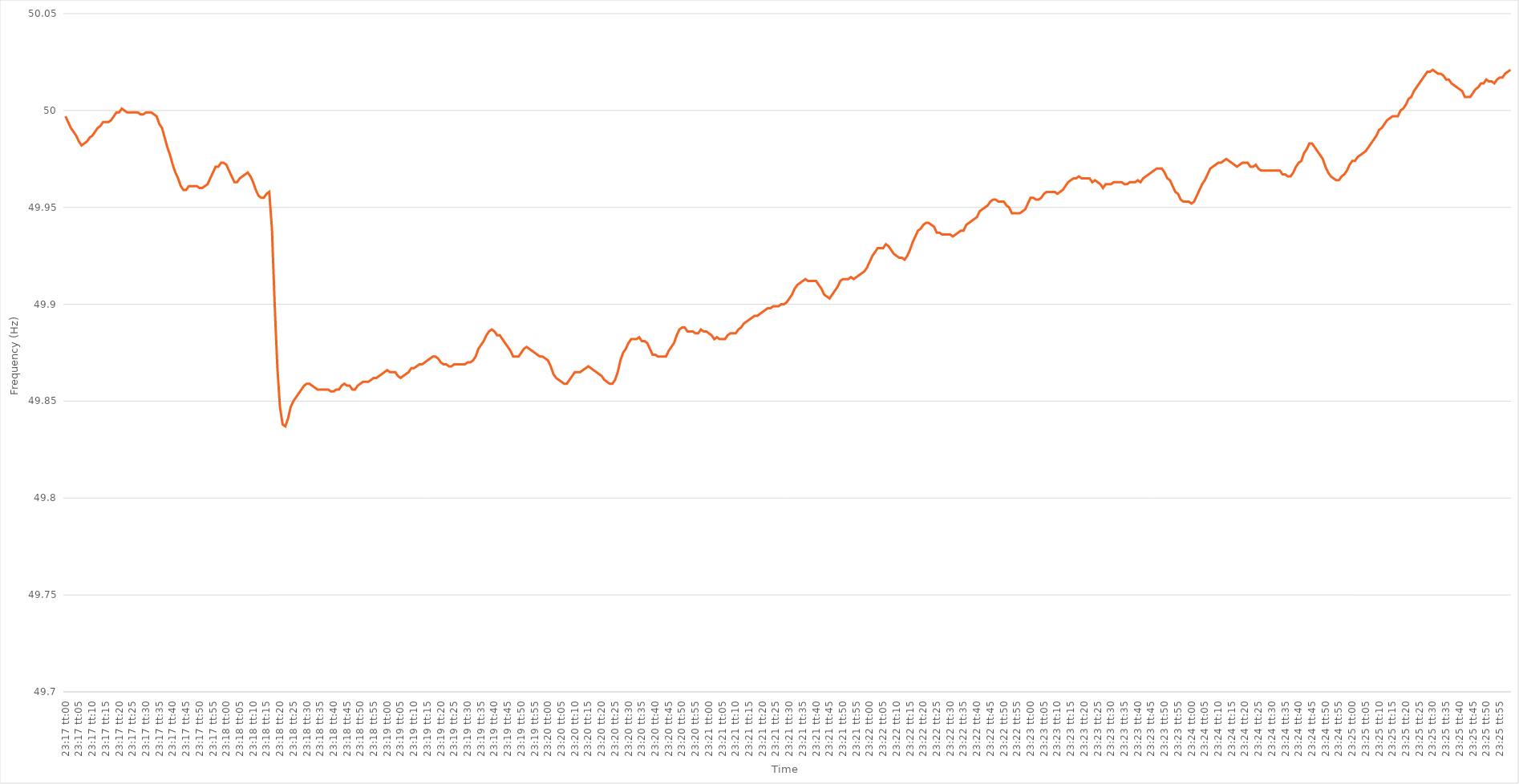
| Category | Series 0 |
|---|---|
| 0.970138888888889 | 49.997 |
| 0.9701504629629629 | 49.994 |
| 0.9701620370370371 | 49.991 |
| 0.9701736111111111 | 49.989 |
| 0.9701851851851852 | 49.987 |
| 0.9701967592592592 | 49.984 |
| 0.9702083333333333 | 49.982 |
| 0.9702199074074075 | 49.983 |
| 0.9702314814814814 | 49.984 |
| 0.9702430555555556 | 49.986 |
| 0.9702546296296296 | 49.987 |
| 0.9702662037037038 | 49.989 |
| 0.9702777777777777 | 49.991 |
| 0.9702893518518518 | 49.992 |
| 0.970300925925926 | 49.994 |
| 0.9703125 | 49.994 |
| 0.9703240740740741 | 49.994 |
| 0.9703356481481481 | 49.995 |
| 0.9703472222222222 | 49.997 |
| 0.9703587962962964 | 49.999 |
| 0.9703703703703703 | 49.999 |
| 0.9703819444444445 | 50.001 |
| 0.9703935185185185 | 50 |
| 0.9704050925925927 | 49.999 |
| 0.9704166666666666 | 49.999 |
| 0.9704282407407407 | 49.999 |
| 0.9704398148148149 | 49.999 |
| 0.9704513888888888 | 49.999 |
| 0.970462962962963 | 49.998 |
| 0.970474537037037 | 49.998 |
| 0.9704861111111112 | 49.999 |
| 0.9704976851851851 | 49.999 |
| 0.9705092592592592 | 49.999 |
| 0.9705208333333334 | 49.998 |
| 0.9705324074074074 | 49.997 |
| 0.9705439814814815 | 49.993 |
| 0.9705555555555555 | 49.991 |
| 0.9705671296296297 | 49.986 |
| 0.9705787037037038 | 49.981 |
| 0.9705902777777777 | 49.977 |
| 0.9706018518518519 | 49.972 |
| 0.9706134259259259 | 49.968 |
| 0.9706250000000001 | 49.965 |
| 0.970636574074074 | 49.961 |
| 0.9706481481481481 | 49.959 |
| 0.9706597222222223 | 49.959 |
| 0.9706712962962962 | 49.961 |
| 0.9706828703703704 | 49.961 |
| 0.9706944444444444 | 49.961 |
| 0.9707060185185186 | 49.961 |
| 0.9707175925925925 | 49.96 |
| 0.9707291666666666 | 49.96 |
| 0.9707407407407408 | 49.961 |
| 0.9707523148148148 | 49.962 |
| 0.9707638888888889 | 49.965 |
| 0.9707754629629629 | 49.968 |
| 0.9707870370370371 | 49.971 |
| 0.9707986111111112 | 49.971 |
| 0.9708101851851851 | 49.973 |
| 0.9708217592592593 | 49.973 |
| 0.9708333333333333 | 49.972 |
| 0.9708449074074075 | 49.969 |
| 0.9708564814814814 | 49.966 |
| 0.9708680555555556 | 49.963 |
| 0.9708796296296297 | 49.963 |
| 0.9708912037037036 | 49.965 |
| 0.9709027777777778 | 49.966 |
| 0.9709143518518518 | 49.967 |
| 0.970925925925926 | 49.968 |
| 0.9709374999999999 | 49.966 |
| 0.970949074074074 | 49.963 |
| 0.9709606481481482 | 49.959 |
| 0.9709722222222222 | 49.956 |
| 0.9709837962962963 | 49.955 |
| 0.9709953703703703 | 49.955 |
| 0.9710069444444445 | 49.957 |
| 0.9710185185185186 | 49.958 |
| 0.9710300925925925 | 49.939 |
| 0.9710416666666667 | 49.901 |
| 0.9710532407407407 | 49.868 |
| 0.9710648148148149 | 49.847 |
| 0.9710763888888888 | 49.838 |
| 0.971087962962963 | 49.837 |
| 0.9710995370370371 | 49.841 |
| 0.971111111111111 | 49.847 |
| 0.9711226851851852 | 49.85 |
| 0.9711342592592592 | 49.852 |
| 0.9711458333333334 | 49.854 |
| 0.9711574074074073 | 49.856 |
| 0.9711689814814815 | 49.858 |
| 0.9711805555555556 | 49.859 |
| 0.9711921296296296 | 49.859 |
| 0.9712037037037037 | 49.858 |
| 0.9712152777777777 | 49.857 |
| 0.9712268518518519 | 49.856 |
| 0.971238425925926 | 49.856 |
| 0.97125 | 49.856 |
| 0.9712615740740741 | 49.856 |
| 0.9712731481481481 | 49.856 |
| 0.9712847222222223 | 49.855 |
| 0.9712962962962962 | 49.855 |
| 0.9713078703703704 | 49.856 |
| 0.9713194444444445 | 49.856 |
| 0.9713310185185186 | 49.858 |
| 0.9713425925925926 | 49.859 |
| 0.9713541666666666 | 49.858 |
| 0.9713657407407408 | 49.858 |
| 0.9713773148148147 | 49.856 |
| 0.9713888888888889 | 49.856 |
| 0.971400462962963 | 49.858 |
| 0.971412037037037 | 49.859 |
| 0.9714236111111111 | 49.86 |
| 0.9714351851851851 | 49.86 |
| 0.9714467592592593 | 49.86 |
| 0.9714583333333334 | 49.861 |
| 0.9714699074074074 | 49.862 |
| 0.9714814814814815 | 49.862 |
| 0.9714930555555555 | 49.863 |
| 0.9715046296296297 | 49.864 |
| 0.9715162037037036 | 49.865 |
| 0.9715277777777778 | 49.866 |
| 0.9715393518518519 | 49.865 |
| 0.971550925925926 | 49.865 |
| 0.9715625 | 49.865 |
| 0.971574074074074 | 49.863 |
| 0.9715856481481482 | 49.862 |
| 0.9715972222222223 | 49.863 |
| 0.9716087962962963 | 49.864 |
| 0.9716203703703704 | 49.865 |
| 0.9716319444444445 | 49.867 |
| 0.9716435185185185 | 49.867 |
| 0.9716550925925925 | 49.868 |
| 0.9716666666666667 | 49.869 |
| 0.9716782407407408 | 49.869 |
| 0.9716898148148148 | 49.87 |
| 0.9717013888888889 | 49.871 |
| 0.971712962962963 | 49.872 |
| 0.9717245370370371 | 49.873 |
| 0.971736111111111 | 49.873 |
| 0.9717476851851852 | 49.872 |
| 0.9717592592592593 | 49.87 |
| 0.9717708333333334 | 49.869 |
| 0.9717824074074074 | 49.869 |
| 0.9717939814814814 | 49.868 |
| 0.9718055555555556 | 49.868 |
| 0.9718171296296297 | 49.869 |
| 0.9718287037037037 | 49.869 |
| 0.9718402777777778 | 49.869 |
| 0.9718518518518519 | 49.869 |
| 0.9718634259259259 | 49.869 |
| 0.9718749999999999 | 49.87 |
| 0.9718865740740741 | 49.87 |
| 0.9718981481481482 | 49.871 |
| 0.9719097222222222 | 49.873 |
| 0.9719212962962963 | 49.877 |
| 0.9719328703703703 | 49.879 |
| 0.9719444444444445 | 49.881 |
| 0.9719560185185184 | 49.884 |
| 0.9719675925925926 | 49.886 |
| 0.9719791666666667 | 49.887 |
| 0.9719907407407408 | 49.886 |
| 0.9720023148148148 | 49.884 |
| 0.9720138888888888 | 49.884 |
| 0.972025462962963 | 49.882 |
| 0.9720370370370371 | 49.88 |
| 0.9720486111111111 | 49.878 |
| 0.9720601851851852 | 49.876 |
| 0.9720717592592593 | 49.873 |
| 0.9720833333333333 | 49.873 |
| 0.9720949074074073 | 49.873 |
| 0.9721064814814815 | 49.875 |
| 0.9721180555555556 | 49.877 |
| 0.9721296296296296 | 49.878 |
| 0.9721412037037037 | 49.877 |
| 0.9721527777777778 | 49.876 |
| 0.9721643518518519 | 49.875 |
| 0.9721759259259258 | 49.874 |
| 0.9721875 | 49.873 |
| 0.9721990740740741 | 49.873 |
| 0.9722106481481482 | 49.872 |
| 0.9722222222222222 | 49.871 |
| 0.9722337962962962 | 49.868 |
| 0.9722453703703704 | 49.864 |
| 0.9722569444444445 | 49.862 |
| 0.9722685185185185 | 49.861 |
| 0.9722800925925926 | 49.86 |
| 0.9722916666666667 | 49.859 |
| 0.9723032407407407 | 49.859 |
| 0.9723148148148147 | 49.861 |
| 0.9723263888888889 | 49.863 |
| 0.972337962962963 | 49.865 |
| 0.972349537037037 | 49.865 |
| 0.9723611111111111 | 49.865 |
| 0.9723726851851852 | 49.866 |
| 0.9723842592592593 | 49.867 |
| 0.9723958333333332 | 49.868 |
| 0.9724074074074074 | 49.867 |
| 0.9724189814814815 | 49.866 |
| 0.9724305555555556 | 49.865 |
| 0.9724421296296296 | 49.864 |
| 0.9724537037037037 | 49.863 |
| 0.9724652777777778 | 49.861 |
| 0.972476851851852 | 49.86 |
| 0.9724884259259259 | 49.859 |
| 0.9725 | 49.859 |
| 0.9725115740740741 | 49.861 |
| 0.9725231481481482 | 49.865 |
| 0.9725347222222221 | 49.871 |
| 0.9725462962962963 | 49.875 |
| 0.9725578703703704 | 49.877 |
| 0.9725694444444444 | 49.88 |
| 0.9725810185185185 | 49.882 |
| 0.9725925925925926 | 49.882 |
| 0.9726041666666667 | 49.882 |
| 0.9726157407407406 | 49.883 |
| 0.9726273148148148 | 49.881 |
| 0.9726388888888889 | 49.881 |
| 0.972650462962963 | 49.88 |
| 0.972662037037037 | 49.877 |
| 0.9726736111111111 | 49.874 |
| 0.9726851851851852 | 49.874 |
| 0.9726967592592594 | 49.873 |
| 0.9727083333333333 | 49.873 |
| 0.9727199074074074 | 49.873 |
| 0.9727314814814815 | 49.873 |
| 0.9727430555555556 | 49.876 |
| 0.9727546296296296 | 49.878 |
| 0.9727662037037037 | 49.88 |
| 0.9727777777777779 | 49.884 |
| 0.9727893518518518 | 49.887 |
| 0.9728009259259259 | 49.888 |
| 0.9728125 | 49.888 |
| 0.9728240740740741 | 49.886 |
| 0.972835648148148 | 49.886 |
| 0.9728472222222222 | 49.886 |
| 0.9728587962962963 | 49.885 |
| 0.9728703703703704 | 49.885 |
| 0.9728819444444444 | 49.887 |
| 0.9728935185185185 | 49.886 |
| 0.9729050925925926 | 49.886 |
| 0.9729166666666668 | 49.885 |
| 0.9729282407407407 | 49.884 |
| 0.9729398148148148 | 49.882 |
| 0.9729513888888889 | 49.883 |
| 0.972962962962963 | 49.882 |
| 0.972974537037037 | 49.882 |
| 0.9729861111111111 | 49.882 |
| 0.9729976851851853 | 49.884 |
| 0.9730092592592593 | 49.885 |
| 0.9730208333333333 | 49.885 |
| 0.9730324074074074 | 49.885 |
| 0.9730439814814815 | 49.887 |
| 0.9730555555555555 | 49.888 |
| 0.9730671296296296 | 49.89 |
| 0.9730787037037038 | 49.891 |
| 0.9730902777777778 | 49.892 |
| 0.9731018518518518 | 49.893 |
| 0.9731134259259259 | 49.894 |
| 0.973125 | 49.894 |
| 0.9731365740740742 | 49.895 |
| 0.9731481481481481 | 49.896 |
| 0.9731597222222222 | 49.897 |
| 0.9731712962962963 | 49.898 |
| 0.9731828703703704 | 49.898 |
| 0.9731944444444444 | 49.899 |
| 0.9732060185185185 | 49.899 |
| 0.9732175925925927 | 49.899 |
| 0.9732291666666667 | 49.9 |
| 0.9732407407407407 | 49.9 |
| 0.9732523148148148 | 49.901 |
| 0.9732638888888889 | 49.903 |
| 0.9732754629629629 | 49.905 |
| 0.973287037037037 | 49.908 |
| 0.9732986111111112 | 49.91 |
| 0.9733101851851852 | 49.911 |
| 0.9733217592592592 | 49.912 |
| 0.9733333333333333 | 49.913 |
| 0.9733449074074074 | 49.912 |
| 0.9733564814814816 | 49.912 |
| 0.9733680555555555 | 49.912 |
| 0.9733796296296297 | 49.912 |
| 0.9733912037037037 | 49.91 |
| 0.9734027777777778 | 49.908 |
| 0.9734143518518518 | 49.905 |
| 0.9734259259259259 | 49.904 |
| 0.9734375000000001 | 49.903 |
| 0.9734490740740741 | 49.905 |
| 0.9734606481481481 | 49.907 |
| 0.9734722222222222 | 49.909 |
| 0.9734837962962963 | 49.912 |
| 0.9734953703703703 | 49.913 |
| 0.9735069444444444 | 49.913 |
| 0.9735185185185186 | 49.913 |
| 0.9735300925925926 | 49.914 |
| 0.9735416666666666 | 49.913 |
| 0.9735532407407407 | 49.914 |
| 0.9735648148148148 | 49.915 |
| 0.973576388888889 | 49.916 |
| 0.9735879629629629 | 49.917 |
| 0.973599537037037 | 49.919 |
| 0.9736111111111111 | 49.922 |
| 0.9736226851851852 | 49.925 |
| 0.9736342592592592 | 49.927 |
| 0.9736458333333333 | 49.929 |
| 0.9736574074074075 | 49.929 |
| 0.9736689814814815 | 49.929 |
| 0.9736805555555555 | 49.931 |
| 0.9736921296296296 | 49.93 |
| 0.9737037037037037 | 49.928 |
| 0.9737152777777777 | 49.926 |
| 0.9737268518518518 | 49.925 |
| 0.973738425925926 | 49.924 |
| 0.97375 | 49.924 |
| 0.973761574074074 | 49.923 |
| 0.9737731481481481 | 49.925 |
| 0.9737847222222222 | 49.928 |
| 0.9737962962962964 | 49.932 |
| 0.9738078703703703 | 49.935 |
| 0.9738194444444445 | 49.938 |
| 0.9738310185185185 | 49.939 |
| 0.9738425925925926 | 49.941 |
| 0.9738541666666666 | 49.942 |
| 0.9738657407407407 | 49.942 |
| 0.9738773148148149 | 49.941 |
| 0.9738888888888889 | 49.94 |
| 0.973900462962963 | 49.937 |
| 0.973912037037037 | 49.937 |
| 0.9739236111111111 | 49.936 |
| 0.9739351851851853 | 49.936 |
| 0.9739467592592592 | 49.936 |
| 0.9739583333333334 | 49.936 |
| 0.9739699074074074 | 49.935 |
| 0.9739814814814814 | 49.936 |
| 0.9739930555555555 | 49.937 |
| 0.9740046296296296 | 49.938 |
| 0.9740162037037038 | 49.938 |
| 0.9740277777777777 | 49.941 |
| 0.9740393518518519 | 49.942 |
| 0.9740509259259259 | 49.943 |
| 0.9740625 | 49.944 |
| 0.974074074074074 | 49.945 |
| 0.9740856481481481 | 49.948 |
| 0.9740972222222223 | 49.949 |
| 0.9741087962962963 | 49.95 |
| 0.9741203703703704 | 49.951 |
| 0.9741319444444444 | 49.953 |
| 0.9741435185185185 | 49.954 |
| 0.9741550925925927 | 49.954 |
| 0.9741666666666666 | 49.953 |
| 0.9741782407407408 | 49.953 |
| 0.9741898148148148 | 49.953 |
| 0.974201388888889 | 49.951 |
| 0.9742129629629629 | 49.95 |
| 0.974224537037037 | 49.947 |
| 0.9742361111111112 | 49.947 |
| 0.9742476851851851 | 49.947 |
| 0.9742592592592593 | 49.947 |
| 0.9742708333333333 | 49.948 |
| 0.9742824074074075 | 49.949 |
| 0.9742939814814814 | 49.952 |
| 0.9743055555555555 | 49.955 |
| 0.9743171296296297 | 49.955 |
| 0.9743287037037037 | 49.954 |
| 0.9743402777777778 | 49.954 |
| 0.9743518518518518 | 49.955 |
| 0.974363425925926 | 49.957 |
| 0.9743750000000001 | 49.958 |
| 0.974386574074074 | 49.958 |
| 0.9743981481481482 | 49.958 |
| 0.9744097222222222 | 49.958 |
| 0.9744212962962964 | 49.957 |
| 0.9744328703703703 | 49.958 |
| 0.9744444444444444 | 49.959 |
| 0.9744560185185186 | 49.961 |
| 0.9744675925925925 | 49.963 |
| 0.9744791666666667 | 49.964 |
| 0.9744907407407407 | 49.965 |
| 0.9745023148148149 | 49.965 |
| 0.9745138888888888 | 49.966 |
| 0.9745254629629629 | 49.965 |
| 0.9745370370370371 | 49.965 |
| 0.9745486111111111 | 49.965 |
| 0.9745601851851852 | 49.965 |
| 0.9745717592592592 | 49.963 |
| 0.9745833333333334 | 49.964 |
| 0.9745949074074075 | 49.963 |
| 0.9746064814814814 | 49.962 |
| 0.9746180555555556 | 49.96 |
| 0.9746296296296296 | 49.962 |
| 0.9746412037037038 | 49.962 |
| 0.9746527777777777 | 49.962 |
| 0.9746643518518519 | 49.963 |
| 0.974675925925926 | 49.963 |
| 0.9746874999999999 | 49.963 |
| 0.9746990740740741 | 49.963 |
| 0.9747106481481481 | 49.962 |
| 0.9747222222222223 | 49.962 |
| 0.9747337962962962 | 49.963 |
| 0.9747453703703703 | 49.963 |
| 0.9747569444444445 | 49.963 |
| 0.9747685185185185 | 49.964 |
| 0.9747800925925926 | 49.963 |
| 0.9747916666666666 | 49.965 |
| 0.9748032407407408 | 49.966 |
| 0.9748148148148149 | 49.967 |
| 0.9748263888888888 | 49.968 |
| 0.974837962962963 | 49.969 |
| 0.974849537037037 | 49.97 |
| 0.9748611111111112 | 49.97 |
| 0.9748726851851851 | 49.97 |
| 0.9748842592592593 | 49.968 |
| 0.9748958333333334 | 49.965 |
| 0.9749074074074073 | 49.964 |
| 0.9749189814814815 | 49.961 |
| 0.9749305555555555 | 49.958 |
| 0.9749421296296297 | 49.957 |
| 0.9749537037037036 | 49.954 |
| 0.9749652777777778 | 49.953 |
| 0.9749768518518519 | 49.953 |
| 0.9749884259259259 | 49.953 |
| 0.975 | 49.952 |
| 0.975011574074074 | 49.953 |
| 0.9750231481481482 | 49.956 |
| 0.9750347222222223 | 49.959 |
| 0.9750462962962962 | 49.962 |
| 0.9750578703703704 | 49.964 |
| 0.9750694444444444 | 49.967 |
| 0.9750810185185186 | 49.97 |
| 0.9750925925925925 | 49.971 |
| 0.9751041666666667 | 49.972 |
| 0.9751157407407408 | 49.973 |
| 0.9751273148148148 | 49.973 |
| 0.9751388888888889 | 49.974 |
| 0.9751504629629629 | 49.975 |
| 0.9751620370370371 | 49.974 |
| 0.975173611111111 | 49.973 |
| 0.9751851851851852 | 49.972 |
| 0.9751967592592593 | 49.971 |
| 0.9752083333333333 | 49.972 |
| 0.9752199074074074 | 49.973 |
| 0.9752314814814814 | 49.973 |
| 0.9752430555555556 | 49.973 |
| 0.9752546296296297 | 49.971 |
| 0.9752662037037036 | 49.971 |
| 0.9752777777777778 | 49.972 |
| 0.9752893518518518 | 49.97 |
| 0.975300925925926 | 49.969 |
| 0.9753124999999999 | 49.969 |
| 0.9753240740740741 | 49.969 |
| 0.9753356481481482 | 49.969 |
| 0.9753472222222223 | 49.969 |
| 0.9753587962962963 | 49.969 |
| 0.9753703703703703 | 49.969 |
| 0.9753819444444445 | 49.969 |
| 0.9753935185185184 | 49.967 |
| 0.9754050925925926 | 49.967 |
| 0.9754166666666667 | 49.966 |
| 0.9754282407407407 | 49.966 |
| 0.9754398148148148 | 49.968 |
| 0.9754513888888888 | 49.971 |
| 0.975462962962963 | 49.973 |
| 0.9754745370370371 | 49.974 |
| 0.975486111111111 | 49.978 |
| 0.9754976851851852 | 49.98 |
| 0.9755092592592592 | 49.983 |
| 0.9755208333333334 | 49.983 |
| 0.9755324074074073 | 49.981 |
| 0.9755439814814815 | 49.979 |
| 0.9755555555555556 | 49.977 |
| 0.9755671296296297 | 49.975 |
| 0.9755787037037037 | 49.971 |
| 0.9755902777777777 | 49.968 |
| 0.9756018518518519 | 49.966 |
| 0.975613425925926 | 49.965 |
| 0.975625 | 49.964 |
| 0.9756365740740741 | 49.964 |
| 0.9756481481481482 | 49.966 |
| 0.9756597222222222 | 49.967 |
| 0.9756712962962962 | 49.969 |
| 0.9756828703703704 | 49.972 |
| 0.9756944444444445 | 49.974 |
| 0.9757060185185185 | 49.974 |
| 0.9757175925925926 | 49.976 |
| 0.9757291666666666 | 49.977 |
| 0.9757407407407408 | 49.978 |
| 0.9757523148148147 | 49.979 |
| 0.9757638888888889 | 49.981 |
| 0.975775462962963 | 49.983 |
| 0.9757870370370371 | 49.985 |
| 0.9757986111111111 | 49.987 |
| 0.9758101851851851 | 49.99 |
| 0.9758217592592593 | 49.991 |
| 0.9758333333333334 | 49.993 |
| 0.9758449074074074 | 49.995 |
| 0.9758564814814815 | 49.996 |
| 0.9758680555555556 | 49.997 |
| 0.9758796296296296 | 49.997 |
| 0.9758912037037036 | 49.997 |
| 0.9759027777777778 | 50 |
| 0.9759143518518519 | 50.001 |
| 0.9759259259259259 | 50.003 |
| 0.9759375 | 50.006 |
| 0.975949074074074 | 50.007 |
| 0.9759606481481482 | 50.01 |
| 0.9759722222222221 | 50.012 |
| 0.9759837962962963 | 50.014 |
| 0.9759953703703704 | 50.016 |
| 0.9760069444444445 | 50.018 |
| 0.9760185185185185 | 50.02 |
| 0.9760300925925925 | 50.02 |
| 0.9760416666666667 | 50.021 |
| 0.9760532407407408 | 50.02 |
| 0.9760648148148148 | 50.019 |
| 0.9760763888888889 | 50.019 |
| 0.976087962962963 | 50.018 |
| 0.976099537037037 | 50.016 |
| 0.976111111111111 | 50.016 |
| 0.9761226851851852 | 50.014 |
| 0.9761342592592593 | 50.013 |
| 0.9761458333333333 | 50.012 |
| 0.9761574074074074 | 50.011 |
| 0.9761689814814815 | 50.01 |
| 0.9761805555555556 | 50.007 |
| 0.9761921296296295 | 50.007 |
| 0.9762037037037037 | 50.007 |
| 0.9762152777777778 | 50.009 |
| 0.9762268518518519 | 50.011 |
| 0.9762384259259259 | 50.012 |
| 0.97625 | 50.014 |
| 0.9762615740740741 | 50.014 |
| 0.9762731481481483 | 50.016 |
| 0.9762847222222222 | 50.015 |
| 0.9762962962962963 | 50.015 |
| 0.9763078703703704 | 50.014 |
| 0.9763194444444444 | 50.016 |
| 0.9763310185185184 | 50.017 |
| 0.9763425925925926 | 50.017 |
| 0.9763541666666667 | 50.019 |
| 0.9763657407407407 | 50.02 |
| 0.9763773148148148 | 50.021 |